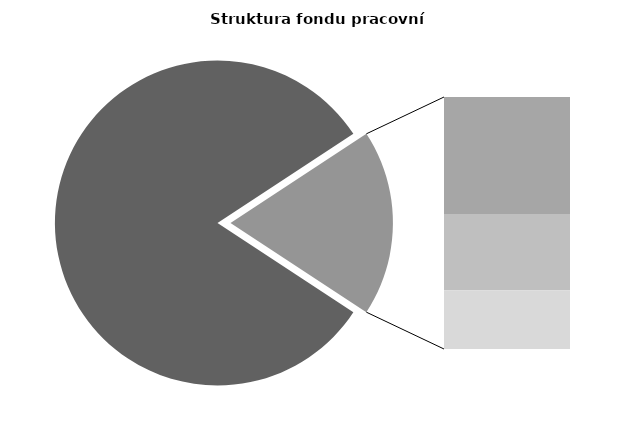
| Category | Series 0 |
|---|---|
| Průměrná měsíční odpracovaná doba bez přesčasu | 137.625 |
| Dovolená | 14.496 |
| Nemoc | 9.439 |
| Jiné | 7.28 |